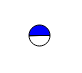
| Category | Series 0 |
|---|---|
| 0 | 16302 |
| 1 | 16526 |